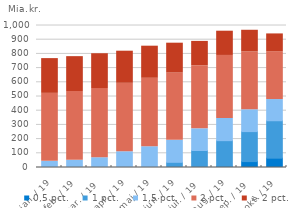
| Category | 0,5 pct. | 1 pct. | 1,5 pct. | 2 pct. | > 2 pct. |
|---|---|---|---|---|---|
| 2019-01-01 | 0 | 0 | 43.561 | 478.438 | 244.868 |
| 2019-02-01 | 0 | 0 | 50.795 | 484.299 | 245.563 |
| 2019-03-01 | 0 | 0 | 68.758 | 487.329 | 245.141 |
| 2019-04-01 | 0 | 0.685 | 110.149 | 482.158 | 226.036 |
| 2019-05-01 | 0 | 1.78 | 144.421 | 482.06 | 226.099 |
| 2019-06-01 | 0 | 36.56 | 154.921 | 473.771 | 210.217 |
| 2019-07-01 | 0 | 119.705 | 152.803 | 444.471 | 171.067 |
| 2019-08-01 | 8.159 | 180.873 | 156.344 | 443.678 | 170.778 |
| 2019-09-01 | 41.683 | 211.191 | 153.588 | 407.224 | 152.783 |
| 2019-10-01 | 65.685 | 263.622 | 149.275 | 337.322 | 124.779 |